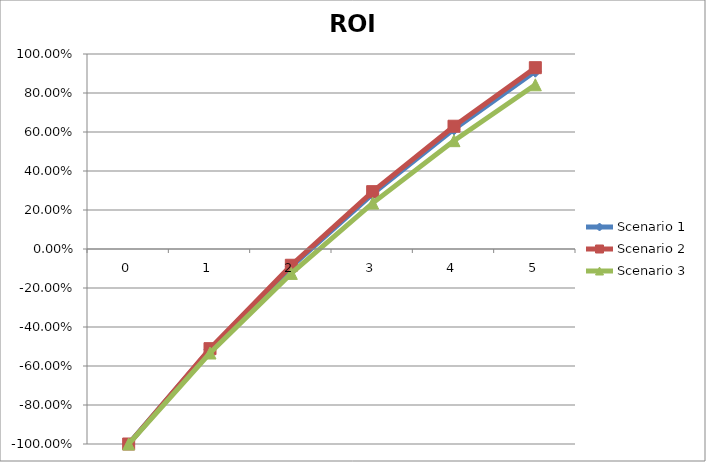
| Category | Scenario 1 | Scenario 2 | Scenario 3 |
|---|---|---|---|
| 0.0 | -1 | -1 | -1 |
| 1.0 | -0.515 | -0.511 | -0.533 |
| 2.0 | -0.091 | -0.083 | -0.125 |
| 3.0 | 0.283 | 0.294 | 0.235 |
| 4.0 | 0.615 | 0.63 | 0.556 |
| 5.0 | 0.912 | 0.93 | 0.842 |